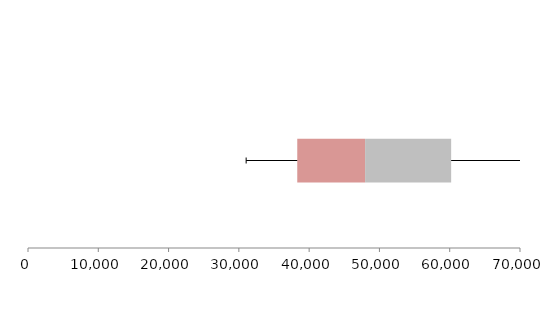
| Category | Series 1 | Series 2 | Series 3 |
|---|---|---|---|
| 0 | 38309.068 | 9652.661 | 12242.002 |